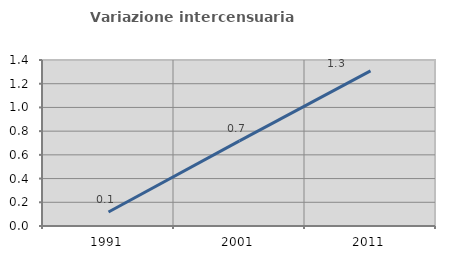
| Category | Variazione intercensuaria annua |
|---|---|
| 1991.0 | 0.118 |
| 2001.0 | 0.718 |
| 2011.0 | 1.308 |